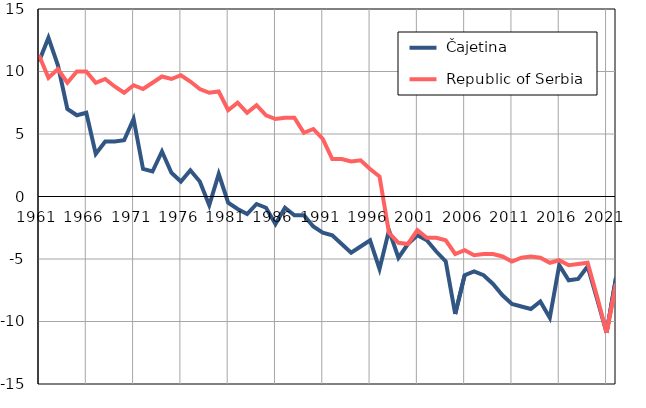
| Category |  Čajetina |  Republic of Serbia |
|---|---|---|
| 1961.0 | 10.8 | 11.3 |
| 1962.0 | 12.7 | 9.5 |
| 1963.0 | 10.5 | 10.2 |
| 1964.0 | 7 | 9.1 |
| 1965.0 | 6.5 | 10 |
| 1966.0 | 6.7 | 10 |
| 1967.0 | 3.4 | 9.1 |
| 1968.0 | 4.4 | 9.4 |
| 1969.0 | 4.4 | 8.8 |
| 1970.0 | 4.5 | 8.3 |
| 1971.0 | 6.2 | 8.9 |
| 1972.0 | 2.2 | 8.6 |
| 1973.0 | 2 | 9.1 |
| 1974.0 | 3.6 | 9.6 |
| 1975.0 | 1.9 | 9.4 |
| 1976.0 | 1.2 | 9.7 |
| 1977.0 | 2.1 | 9.2 |
| 1978.0 | 1.2 | 8.6 |
| 1979.0 | -0.7 | 8.3 |
| 1980.0 | 1.8 | 8.4 |
| 1981.0 | -0.5 | 6.9 |
| 1982.0 | -1 | 7.5 |
| 1983.0 | -1.4 | 6.7 |
| 1984.0 | -0.6 | 7.3 |
| 1985.0 | -0.9 | 6.5 |
| 1986.0 | -2.2 | 6.2 |
| 1987.0 | -0.9 | 6.3 |
| 1988.0 | -1.5 | 6.3 |
| 1989.0 | -1.5 | 5.1 |
| 1990.0 | -2.4 | 5.4 |
| 1991.0 | -2.9 | 4.6 |
| 1992.0 | -3.1 | 3 |
| 1993.0 | -3.8 | 3 |
| 1994.0 | -4.5 | 2.8 |
| 1995.0 | -4 | 2.9 |
| 1996.0 | -3.5 | 2.2 |
| 1997.0 | -5.8 | 1.6 |
| 1998.0 | -2.7 | -2.9 |
| 1999.0 | -4.9 | -3.7 |
| 2000.0 | -3.8 | -3.8 |
| 2001.0 | -3.1 | -2.7 |
| 2002.0 | -3.5 | -3.3 |
| 2003.0 | -4.4 | -3.3 |
| 2004.0 | -5.2 | -3.5 |
| 2005.0 | -9.4 | -4.6 |
| 2006.0 | -6.3 | -4.3 |
| 2007.0 | -6 | -4.7 |
| 2008.0 | -6.3 | -4.6 |
| 2009.0 | -7 | -4.6 |
| 2010.0 | -7.9 | -4.8 |
| 2011.0 | -8.6 | -5.2 |
| 2012.0 | -8.8 | -4.9 |
| 2013.0 | -9 | -4.8 |
| 2014.0 | -8.4 | -4.9 |
| 2015.0 | -9.7 | -5.3 |
| 2016.0 | -5.5 | -5.1 |
| 2017.0 | -6.7 | -5.5 |
| 2018.0 | -6.6 | -5.4 |
| 2019.0 | -5.6 | -5.3 |
| 2020.0 | -8.2 | -8 |
| 2021.0 | -10.9 | -10.9 |
| 2022.0 | -6.5 | -7 |